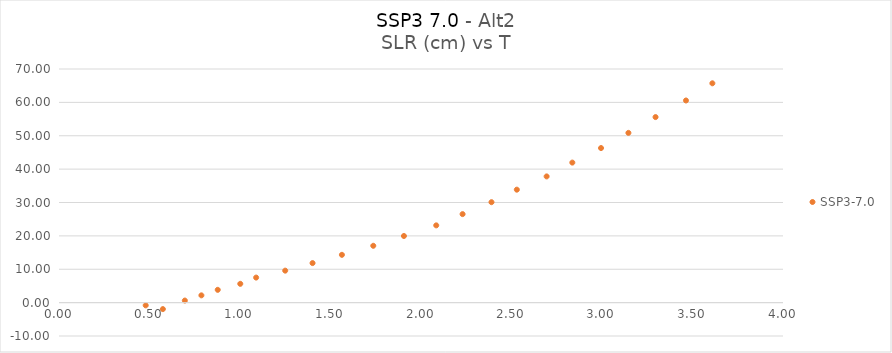
| Category | SSP3-7.0 |
|---|---|
| 0.573801925 | -1.941 |
| 0.479031654 | -0.818 |
| 0.695197934 | 0.621 |
| 0.786748548 | 2.18 |
| 0.877021499 | 3.834 |
| 1.001520332 | 5.633 |
| 1.089128948 | 7.505 |
| 1.249789297 | 9.582 |
| 1.40082264 | 11.846 |
| 1.563054909 | 14.321 |
| 1.736356954 | 17.029 |
| 1.905646517 | 19.966 |
| 2.084158089 | 23.15 |
| 2.229721962 | 26.517 |
| 2.38944116 | 30.096 |
| 2.529428217 | 33.844 |
| 2.694105726 | 37.814 |
| 2.836064375 | 41.959 |
| 2.994636226 | 46.312 |
| 3.14596335 | 50.859 |
| 3.295843187 | 55.597 |
| 3.46399656 | 60.565 |
| 3.609801107 | 65.715 |